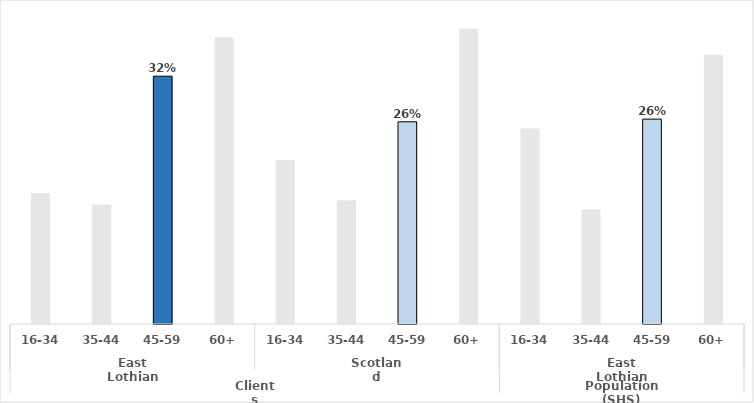
| Category | Series 0 |
|---|---|
| 0 | 0.167 |
| 1 | 0.152 |
| 2 | 0.316 |
| 3 | 0.365 |
| 4 | 0.209 |
| 5 | 0.158 |
| 6 | 0.258 |
| 7 | 0.376 |
| 8 | 0.249 |
| 9 | 0.146 |
| 10 | 0.261 |
| 11 | 0.343 |